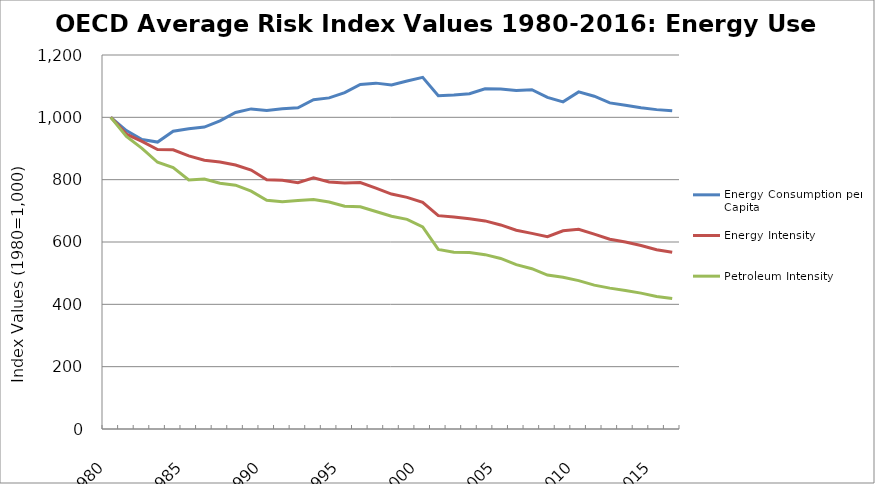
| Category | Energy Consumption per Capita | Energy Intensity | Petroleum Intensity |
|---|---|---|---|
| 1980.0 | 1000 | 1000 | 1000 |
| 1981.0 | 957.45 | 946.078 | 938.871 |
| 1982.0 | 928.878 | 923.025 | 900.335 |
| 1983.0 | 920.654 | 896.665 | 855.881 |
| 1984.0 | 955.319 | 895.92 | 838.42 |
| 1985.0 | 963.328 | 876.226 | 799.134 |
| 1986.0 | 968.902 | 862.319 | 801.821 |
| 1987.0 | 988.894 | 856.956 | 788.571 |
| 1988.0 | 1015.74 | 847.084 | 782.382 |
| 1989.0 | 1027.046 | 830.987 | 762.916 |
| 1990.0 | 1022.009 | 799.467 | 734.184 |
| 1991.0 | 1027.868 | 798.212 | 729.258 |
| 1992.0 | 1030.436 | 790.1 | 732.871 |
| 1993.0 | 1056.508 | 806.053 | 736.06 |
| 1994.0 | 1062.373 | 792.539 | 728.177 |
| 1995.0 | 1079.505 | 789.247 | 714.569 |
| 1996.0 | 1105.702 | 790.89 | 712.849 |
| 1997.0 | 1109.731 | 772.659 | 698.038 |
| 1998.0 | 1104.008 | 753.837 | 682.706 |
| 1999.0 | 1116.575 | 743.302 | 672.523 |
| 2000.0 | 1128.435 | 727.549 | 648.279 |
| 2001.0 | 1069.038 | 684.624 | 576.396 |
| 2002.0 | 1071.761 | 680.483 | 567.451 |
| 2003.0 | 1075.838 | 674.454 | 565.932 |
| 2004.0 | 1091.333 | 667.734 | 559.444 |
| 2005.0 | 1090.771 | 654.737 | 547.19 |
| 2006.0 | 1086.37 | 637.837 | 527.529 |
| 2007.0 | 1088.45 | 627.672 | 514.259 |
| 2008.0 | 1063.937 | 617.249 | 493.975 |
| 2009.0 | 1049.583 | 635.874 | 486.951 |
| 2010.0 | 1081.69 | 640.99 | 475.968 |
| 2011.0 | 1067.702 | 625.113 | 461.547 |
| 2012.0 | 1046.346 | 608.79 | 452.035 |
| 2013.0 | 1038.935 | 599.837 | 444.636 |
| 2014.0 | 1030.836 | 588.799 | 435.942 |
| 2015.0 | 1024.724 | 575.318 | 425.309 |
| 2016.0 | 1020.929 | 567.304 | 418.423 |